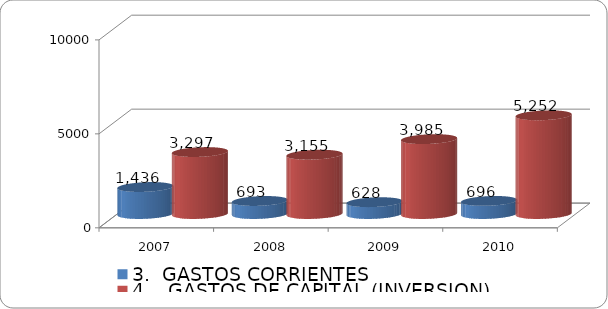
| Category | 3.  GASTOS CORRIENTES | 4.   GASTOS DE CAPITAL (INVERSION) |
|---|---|---|
| 2007 | 1435.869 | 3296.868 |
| 2008 | 692.611 | 3154.83 |
| 2009 | 628.378 | 3984.566 |
| 2010 | 695.841 | 5251.909 |